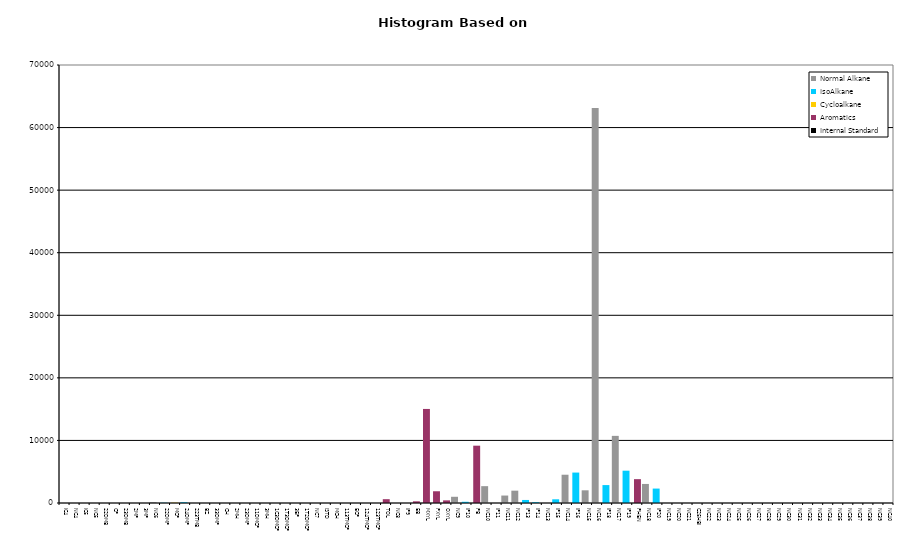
| Category | Normal Alkane | IsoAlkane | Cycloalkane | Aromatics | Internal Standard |
|---|---|---|---|---|---|
| IC4 | 0 | 0 | 0 | 0 | 0 |
| NC4 | 0 | 0 | 0 | 0 | 0 |
| IC5 | 0 | 0 | 0 | 0 | 0 |
| NC5 | 0 | 0 | 0 | 0 | 0 |
| 22DMB | 0 | 0 | 0 | 0 | 0 |
| CP | 0 | 0 | 0 | 0 | 0 |
| 23DMB | 0 | 0 | 0 | 0 | 0 |
| 2MP | 0 | 0 | 0 | 0 | 0 |
| 3MP | 0 | 0 | 0 | 0 | 0 |
| NC6 | 158 | 0 | 0 | 0 | 0 |
| 22DMP | 0 | 40 | 0 | 0 | 0 |
| MCP | 0 | 0 | 47 | 0 | 0 |
| 24DMP | 0 | 120 | 0 | 0 | 0 |
| 223TMB | 0 | 0 | 0 | 0 | 0 |
| BZ | 0 | 0 | 0 | 0 | 0 |
| 33DMP | 0 | 0 | 0 | 0 | 0 |
| CH | 0 | 0 | 0 | 0 | 0 |
| 2MH | 0 | 0 | 0 | 0 | 0 |
| 23DMP | 0 | 0 | 0 | 0 | 0 |
| 11DMCP | 0 | 0 | 0 | 0 | 0 |
| 3MH | 0 | 0 | 0 | 0 | 0 |
| 1C3DMCP | 0 | 0 | 0 | 0 | 0 |
| 1T3DMCP | 0 | 0 | 0 | 0 | 0 |
| 3EP | 0 | 0 | 0 | 0 | 0 |
| 1T2DMCP | 0 | 0 | 0 | 0 | 0 |
| NC7 | 0 | 0 | 0 | 0 | 0 |
| ISTD | 0 | 0 | 0 | 0 | 0 |
| MCH | 0 | 0 | 0 | 0 | 0 |
| 113TMCP | 0 | 0 | 0 | 0 | 0 |
| ECP | 0 | 0 | 0 | 0 | 0 |
| 124TMCP | 0 | 0 | 0 | 0 | 0 |
| 123TMCP | 0 | 0 | 0 | 0 | 0 |
| TOL | 0 | 0 | 0 | 610 | 0 |
| NC8 | 0 | 0 | 0 | 0 | 0 |
| IP9 | 0 | 0 | 0 | 0 | 0 |
| EB | 0 | 0 | 0 | 270 | 0 |
| MXYL | 0 | 0 | 0 | 15031 | 0 |
| PXYL | 0 | 0 | 0 | 1877 | 0 |
| OXYL | 0 | 0 | 0 | 422 | 0 |
| NC9 | 994 | 0 | 0 | 0 | 0 |
| IP10 | 0 | 196 | 0 | 0 | 0 |
| PB | 0 | 0 | 0 | 9160 | 0 |
| NC10 | 2693 | 0 | 0 | 0 | 0 |
| IP11 | 0 | 0 | 0 | 0 | 0 |
| NC11 | 1192 | 0 | 0 | 0 | 0 |
| NC12 | 1970 | 0 | 0 | 0 | 0 |
| IP13 | 0 | 486 | 0 | 0 | 0 |
| IP14 | 0 | 129 | 0 | 0 | 0 |
| NC13 | 0 | 0 | 0 | 0 | 0 |
| IP15 | 0 | 592 | 0 | 0 | 0 |
| NC14 | 4519 | 0 | 0 | 0 | 0 |
| IP16 | 0 | 4864 | 0 | 0 | 0 |
| NC15 | 2029 | 0 | 0 | 0 | 0 |
| NC16 | 63144 | 0 | 0 | 0 | 0 |
| IP18 | 0 | 2864 | 0 | 0 | 0 |
| NC17 | 10728 | 0 | 0 | 0 | 0 |
| IP19 | 0 | 5164 | 0 | 0 | 0 |
| PHEN | 0 | 0 | 0 | 3811 | 0 |
| NC18 | 3043 | 0 | 0 | 0 | 0 |
| IP20 | 0 | 2306 | 0 | 0 | 0 |
| NC19 | 0 | 0 | 0 | 0 | 0 |
| NC20 | 0 | 0 | 0 | 0 | 0 |
| NC21 | 0 | 0 | 0 | 0 | 0 |
| C25HBI | 0 | 0 | 0 | 0 | 0 |
| NC22 | 0 | 0 | 0 | 0 | 0 |
| NC23 | 0 | 0 | 0 | 0 | 0 |
| NC24 | 0 | 0 | 0 | 0 | 0 |
| NC25 | 0 | 0 | 0 | 0 | 0 |
| NC26 | 0 | 0 | 0 | 0 | 0 |
| NC27 | 0 | 0 | 0 | 0 | 0 |
| NC28 | 0 | 0 | 0 | 0 | 0 |
| NC29 | 0 | 0 | 0 | 0 | 0 |
| NC30 | 0 | 0 | 0 | 0 | 0 |
| NC31 | 0 | 0 | 0 | 0 | 0 |
| NC32 | 0 | 0 | 0 | 0 | 0 |
| NC33 | 0 | 0 | 0 | 0 | 0 |
| NC34 | 0 | 0 | 0 | 0 | 0 |
| NC35 | 0 | 0 | 0 | 0 | 0 |
| NC36 | 0 | 0 | 0 | 0 | 0 |
| NC37 | 0 | 0 | 0 | 0 | 0 |
| NC38 | 0 | 0 | 0 | 0 | 0 |
| NC39 | 0 | 0 | 0 | 0 | 0 |
| NC40 | 0 | 0 | 0 | 0 | 0 |